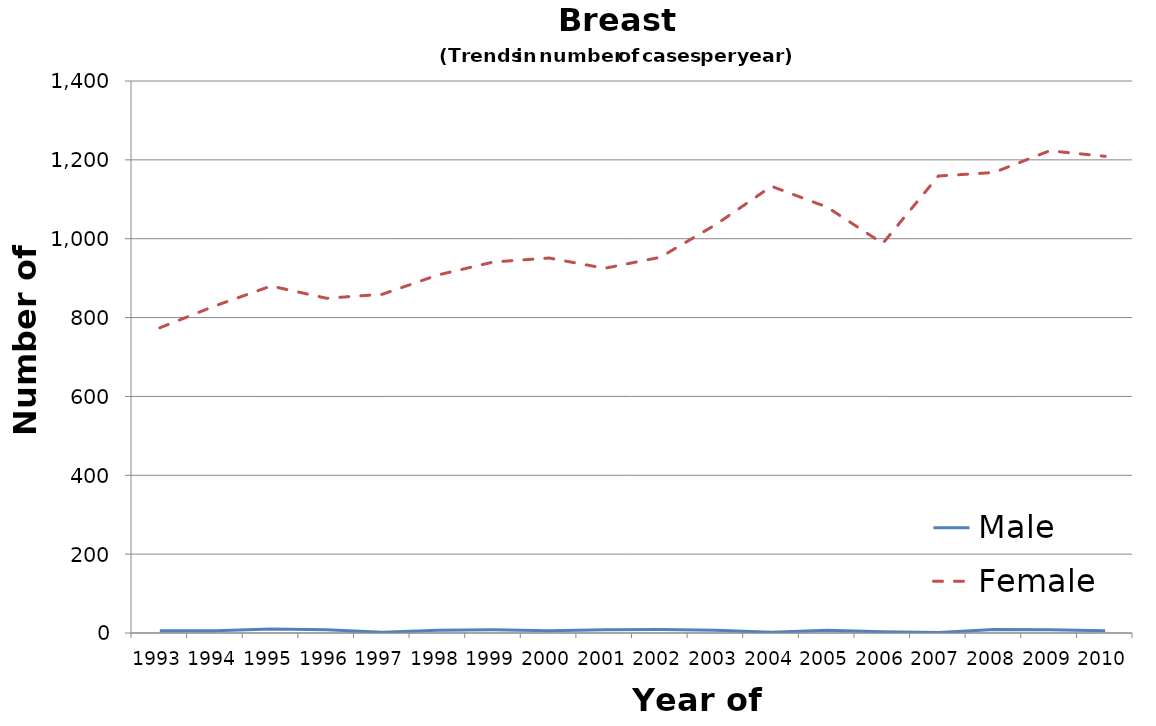
| Category | Male | Female |
|---|---|---|
| 1993.0 | 6 | 774 |
| 1994.0 | 6 | 830 |
| 1995.0 | 10 | 880 |
| 1996.0 | 8 | 849 |
| 1997.0 | 2 | 859 |
| 1998.0 | 7 | 908 |
| 1999.0 | 8 | 941 |
| 2000.0 | 6 | 951 |
| 2001.0 | 8 | 925 |
| 2002.0 | 9 | 953 |
| 2003.0 | 7 | 1036 |
| 2004.0 | 2 | 1133 |
| 2005.0 | 7 | 1080 |
| 2006.0 | 3 | 988 |
| 2007.0 | 1 | 1159 |
| 2008.0 | 9 | 1168 |
| 2009.0 | 8 | 1223 |
| 2010.0 | 6 | 1209 |